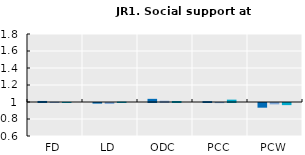
| Category | 2005 | 2010 | 2015 |
|---|---|---|---|
| FD | 1.012 | 1.003 | 1.001 |
| LD | 0.993 | 0.989 | 1.004 |
| ODC | 1.037 | 1.015 | 1.012 |
| PCC | 1.01 | 0.998 | 1.028 |
| PCW | 0.945 | 0.984 | 0.975 |